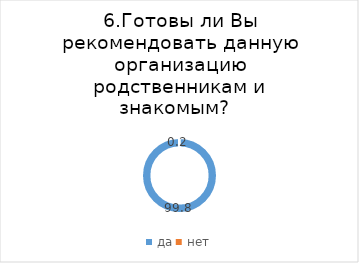
| Category | Series 0 |
|---|---|
| да | 99.808 |
| нет | 0.192 |